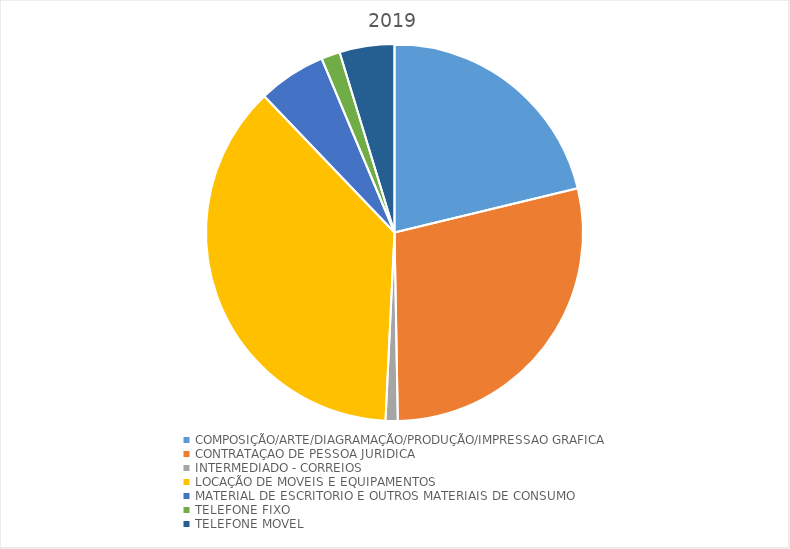
| Category | Series 0 |
|---|---|
| COMPOSIÇÃO/ARTE/DIAGRAMAÇÃO/PRODUÇÃO/IMPRESSAO GRAFICA | 15000 |
| CONTRATAÇAO DE PESSOA JURIDICA | 20132.26 |
| INTERMEDIADO - CORREIOS | 736.6 |
| LOCAÇÃO DE MOVEIS E EQUIPAMENTOS | 26210 |
| MATERIAL DE ESCRITORIO E OUTROS MATERIAIS DE CONSUMO | 4120.55 |
| TELEFONE FIXO | 1139.03 |
| TELEFONE MOVEL | 3323.69 |